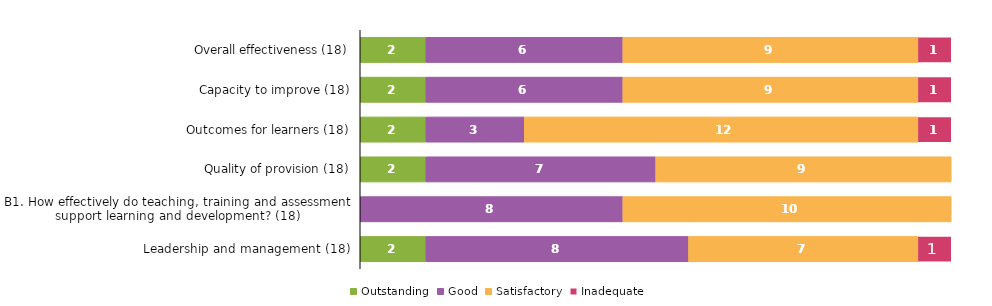
| Category | Outstanding | Good | Satisfactory | Inadequate |
|---|---|---|---|---|
| Overall effectiveness (18) | 2 | 6 | 9 | 1 |
| Capacity to improve (18) | 2 | 6 | 9 | 1 |
| Outcomes for learners (18) | 2 | 3 | 12 | 1 |
| Quality of provision (18) | 2 | 7 | 9 | 0 |
| B1. How effectively do teaching, training and assessment support learning and development? (18) | 0 | 8 | 10 | 0 |
| Leadership and management (18) | 2 | 8 | 7 | 1 |